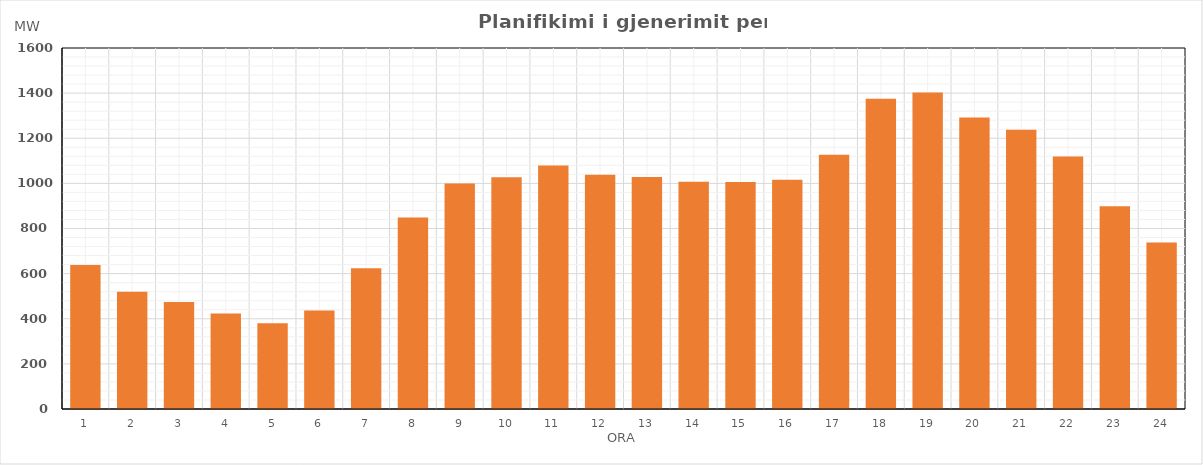
| Category | Max (MW) |
|---|---|
| 0 | 638.48 |
| 1 | 519.28 |
| 2 | 474.06 |
| 3 | 423.58 |
| 4 | 380.37 |
| 5 | 436.09 |
| 6 | 623.92 |
| 7 | 848.8 |
| 8 | 999.05 |
| 9 | 1027.18 |
| 10 | 1079.28 |
| 11 | 1038.33 |
| 12 | 1028.77 |
| 13 | 1006.65 |
| 14 | 1006.15 |
| 15 | 1016.21 |
| 16 | 1127.41 |
| 17 | 1374.59 |
| 18 | 1402.3 |
| 19 | 1291.42 |
| 20 | 1237.91 |
| 21 | 1118.75 |
| 22 | 898.75 |
| 23 | 737.85 |